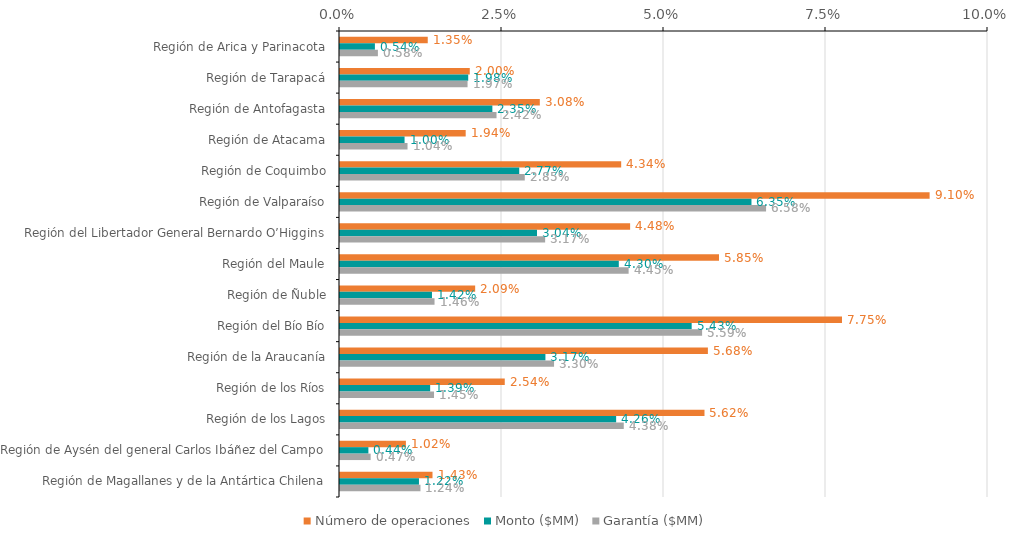
| Category | Número de operaciones | Monto ($MM) | Garantía ($MM) |
|---|---|---|---|
| Región de Arica y Parinacota | 0.014 | 0.005 | 0.006 |
| Región de Tarapacá | 0.02 | 0.02 | 0.02 |
| Región de Antofagasta | 0.031 | 0.024 | 0.024 |
| Región de Atacama | 0.019 | 0.01 | 0.01 |
| Región de Coquimbo | 0.043 | 0.028 | 0.029 |
| Región de Valparaíso | 0.091 | 0.063 | 0.066 |
| Región del Libertador General Bernardo O’Higgins | 0.045 | 0.03 | 0.032 |
| Región del Maule | 0.058 | 0.043 | 0.045 |
| Región de Ñuble | 0.021 | 0.014 | 0.015 |
| Región del Bío Bío | 0.077 | 0.054 | 0.056 |
| Región de la Araucanía | 0.057 | 0.032 | 0.033 |
| Región de los Ríos | 0.025 | 0.014 | 0.015 |
| Región de los Lagos | 0.056 | 0.043 | 0.044 |
| Región de Aysén del general Carlos Ibáñez del Campo | 0.01 | 0.004 | 0.005 |
| Región de Magallanes y de la Antártica Chilena | 0.014 | 0.012 | 0.012 |